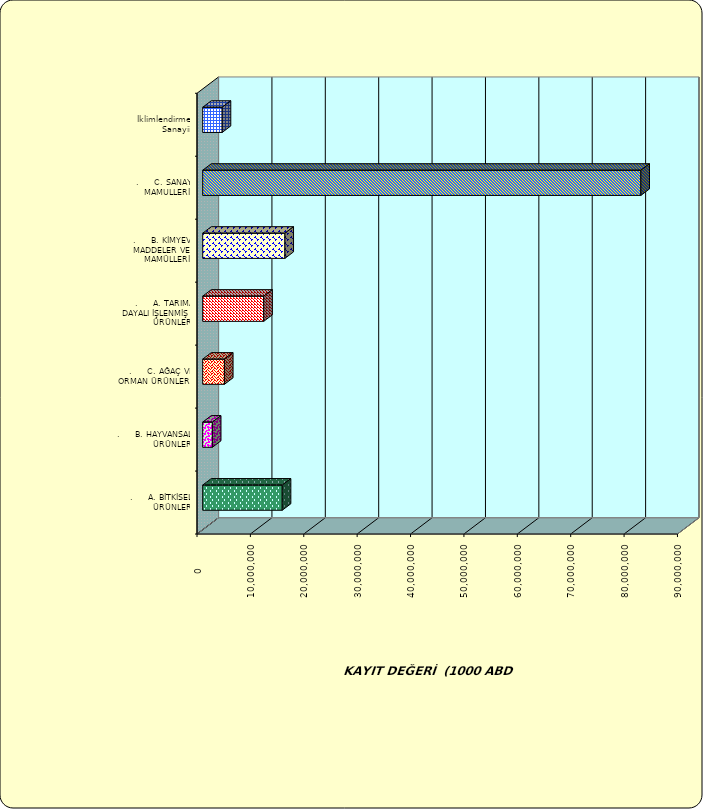
| Category | Series 0 |
|---|---|
| .     A. BİTKİSEL ÜRÜNLER | 14898776.651 |
| .     B. HAYVANSAL ÜRÜNLER | 1813671.993 |
| .     C. AĞAÇ VE ORMAN ÜRÜNLERİ | 4076041.197 |
| .     A. TARIMA DAYALI İŞLENMİŞ ÜRÜNLER | 11433447.888 |
| .     B. KİMYEVİ MADDELER VE MAMÜLLERİ | 15403245.201 |
| .     C. SANAYİ MAMULLERİ | 82079915.621 |
|  İklimlendirme Sanayii | 3648873.545 |